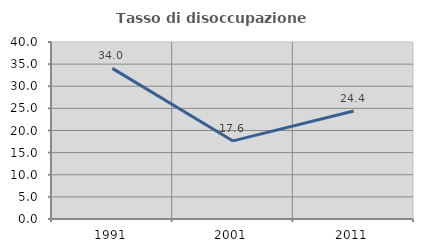
| Category | Tasso di disoccupazione giovanile  |
|---|---|
| 1991.0 | 34.043 |
| 2001.0 | 17.647 |
| 2011.0 | 24.39 |